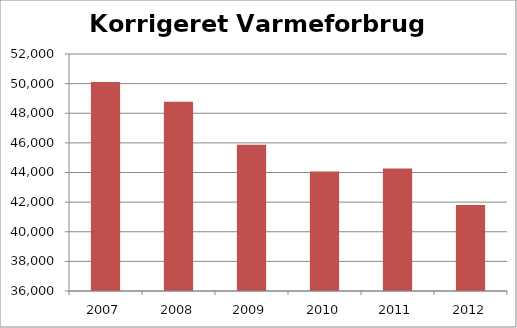
| Category | Korrigeret Varmeforbrug (MWh) |
|---|---|
| 2007.0 | 50102.107 |
| 2008.0 | 48782.488 |
| 2009.0 | 45873.6 |
| 2010.0 | 44063.788 |
| 2011.0 | 44269.432 |
| 2012.0 | 41798.697 |